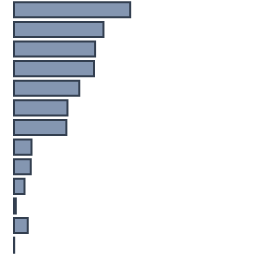
| Category | Percentatge |
|---|---|
| 0 | 48.409 |
| 1 | 37.273 |
| 2 | 33.788 |
| 3 | 33.333 |
| 4 | 27.197 |
| 5 | 22.273 |
| 6 | 21.818 |
| 7 | 7.273 |
| 8 | 6.97 |
| 9 | 4.394 |
| 10 | 0.758 |
| 11 | 5.682 |
| 12 | 0.076 |